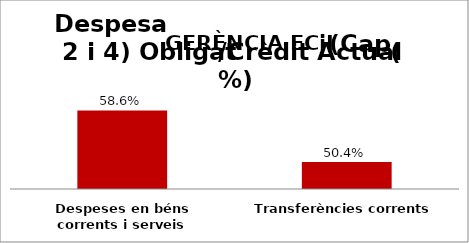
| Category | Series 0 |
|---|---|
| Despeses en béns corrents i serveis | 0.586 |
| Transferències corrents | 0.504 |